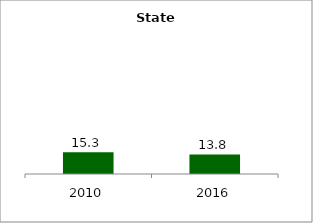
| Category | State |
|---|---|
| 2010.0 | 15.283 |
| 2016.0 | 13.784 |